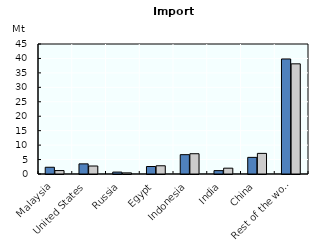
| Category | Baseline | Scenario |
|---|---|---|
| Malaysia | 2.335 | 1.189 |
| United States | 3.509 | 2.766 |
| Russia | 0.66 | 0.393 |
| Egypt | 2.594 | 2.847 |
| Indonesia | 6.694 | 7.02 |
| India | 1.167 | 2.017 |
| China | 5.752 | 7.137 |
| Rest of the world | 39.814 | 38.133 |